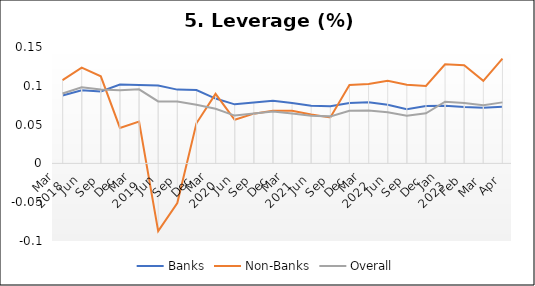
| Category | Banks | Non-Banks | Overall |
|---|---|---|---|
| 0 | 0.088 | 0.107 | 0.09 |
| 1 | 0.094 | 0.123 | 0.098 |
| 2 | 0.093 | 0.112 | 0.095 |
| 3 | 0.102 | 0.046 | 0.094 |
| 4 | 0.101 | 0.054 | 0.095 |
| 5 | 0.1 | -0.087 | 0.08 |
| 6 | 0.095 | -0.051 | 0.08 |
| 7 | 0.095 | 0.052 | 0.076 |
| 8 | 0.084 | 0.09 | 0.07 |
| 9 | 0.076 | 0.056 | 0.062 |
| 10 | 0.079 | 0.064 | 0.064 |
| 11 | 0.081 | 0.068 | 0.067 |
| 12 | 0.078 | 0.068 | 0.064 |
| 13 | 0.074 | 0.063 | 0.061 |
| 14 | 0.074 | 0.059 | 0.061 |
| 15 | 0.078 | 0.101 | 0.068 |
| 16 | 0.079 | 0.102 | 0.068 |
| 17 | 0.075 | 0.106 | 0.066 |
| 18 | 0.07 | 0.102 | 0.061 |
| 19 | 0.074 | 0.1 | 0.064 |
| 20 | 0.074 | 0.128 | 0.079 |
| 21 | 0.073 | 0.126 | 0.078 |
| 22 | 0.072 | 0.106 | 0.075 |
| 23 | 0.073 | 0.135 | 0.079 |